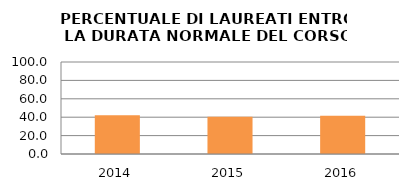
| Category | 2014 2015 2016 |
|---|---|
| 2014.0 | 42.105 |
| 2015.0 | 40.385 |
| 2016.0 | 41.538 |